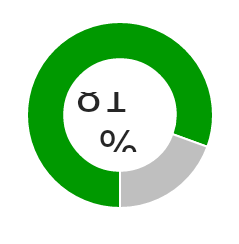
| Category | Series 0 |
|---|---|
| 0 | 0.806 |
| 1 | 0.194 |